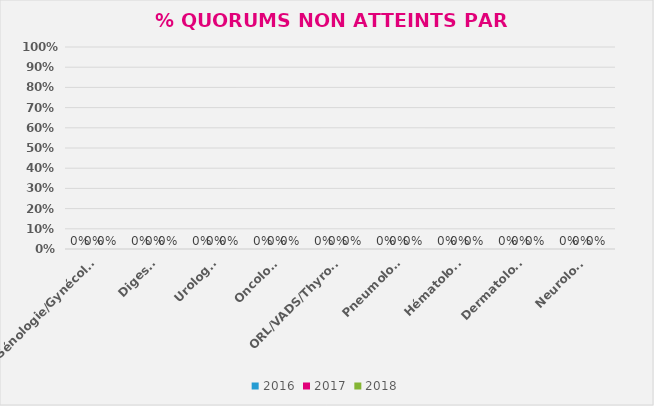
| Category | 2016 | 2017 | 2018 |
|---|---|---|---|
| Sénologie/Gynécologie | 0 | 0 | 0 |
| Digestif | 0 | 0 | 0 |
| Urologie | 0 | 0 | 0 |
| Oncologie | 0 | 0 | 0 |
| ORL/VADS/Thyroïde | 0 | 0 | 0 |
| Pneumologie | 0 | 0 | 0 |
| Hématologie | 0 | 0 | 0 |
| Dermatologie | 0 | 0 | 0 |
| Neurologie | 0 | 0 | 0 |